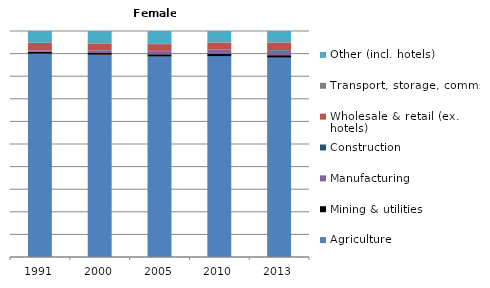
| Category | Agriculture | Mining & utilities  | Manufacturing | Construction | Wholesale & retail (ex. hotels) | Transport, storage, comms | Other (incl. hotels) |
|---|---|---|---|---|---|---|---|
| 1991.0 | 89.9 | 0.9 | 0.5 | 0.1 | 3.2 | 0.1 | 5.2 |
| 2000.0 | 89.5 | 1 | 0.9 | 0.1 | 3 | 0.1 | 5.4 |
| 2005.0 | 88.7 | 1 | 1.4 | 0.1 | 3 | 0.1 | 5.7 |
| 2010.0 | 88.9 | 1 | 1.8 | 0.1 | 3.1 | 0.1 | 5 |
| 2013.0 | 88.2 | 1.1 | 2.1 | 0.2 | 3.3 | 0.1 | 5 |